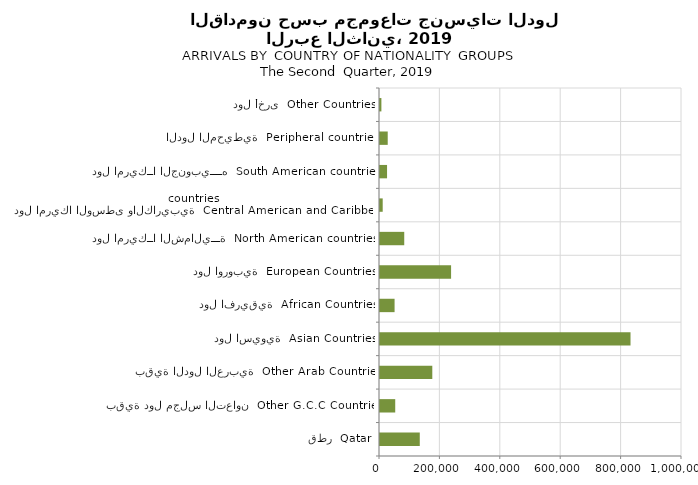
| Category | Series 0 |
|---|---|
| قطر  Qatar | 131712 |
| بقية دول مجلس التعاون  Other G.C.C Countries | 50430 |
| بقية الدول العربية  Other Arab Countries | 173181 |
| دول اسيوية  Asian Countries | 829529 |
| دول افريقية  African Countries | 48268 |
| دول اوروبية  European Countries | 235376 |
| دول امريكــا الشماليـــة  North American countries  | 80275 |
| دول امريكا الوسطى والكاريبية  Central American and Caribbean countries | 8946 |
| دول امريكــا الجنوبيــــه  South American countries | 23352 |
| الدول المحيطية  Peripheral countries | 25558 |
| دول أخرى  Other Countries | 4609 |